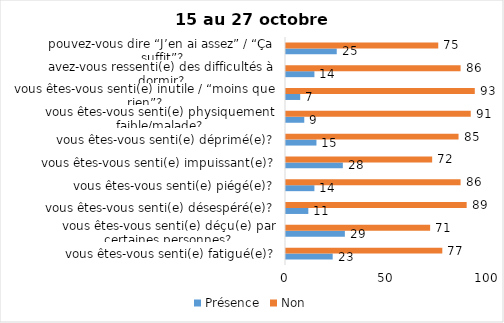
| Category | Présence | Non |
|---|---|---|
| vous êtes-vous senti(e) fatigué(e)? | 23 | 77 |
| vous êtes-vous senti(e) déçu(e) par certaines personnes? | 29 | 71 |
| vous êtes-vous senti(e) désespéré(e)? | 11 | 89 |
| vous êtes-vous senti(e) piégé(e)? | 14 | 86 |
| vous êtes-vous senti(e) impuissant(e)? | 28 | 72 |
| vous êtes-vous senti(e) déprimé(e)? | 15 | 85 |
| vous êtes-vous senti(e) physiquement faible/malade? | 9 | 91 |
| vous êtes-vous senti(e) inutile / “moins que rien”? | 7 | 93 |
| avez-vous ressenti(e) des difficultés à dormir? | 14 | 86 |
| pouvez-vous dire “J’en ai assez” / “Ça suffit”? | 25 | 75 |